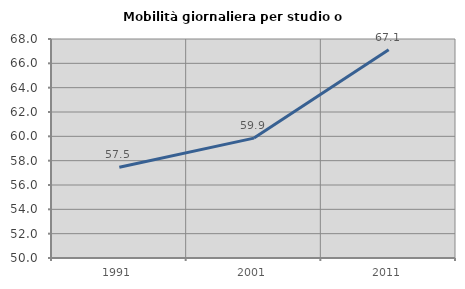
| Category | Mobilità giornaliera per studio o lavoro |
|---|---|
| 1991.0 | 57.455 |
| 2001.0 | 59.854 |
| 2011.0 | 67.123 |